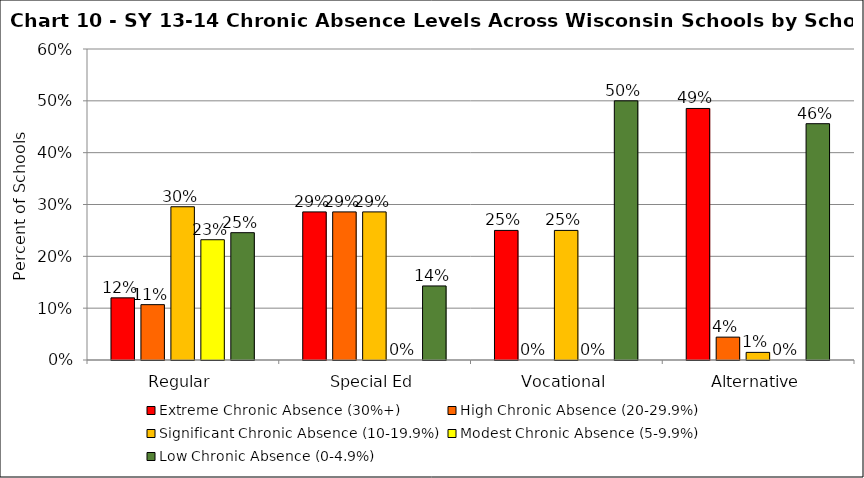
| Category | Extreme Chronic Absence (30%+) | High Chronic Absence (20-29.9%) | Significant Chronic Absence (10-19.9%) | Modest Chronic Absence (5-9.9%) | Low Chronic Absence (0-4.9%) |
|---|---|---|---|---|---|
| 0 | 0.12 | 0.107 | 0.296 | 0.232 | 0.246 |
| 1 | 0.286 | 0.286 | 0.286 | 0 | 0.143 |
| 2 | 0.25 | 0 | 0.25 | 0 | 0.5 |
| 3 | 0.485 | 0.044 | 0.015 | 0 | 0.456 |